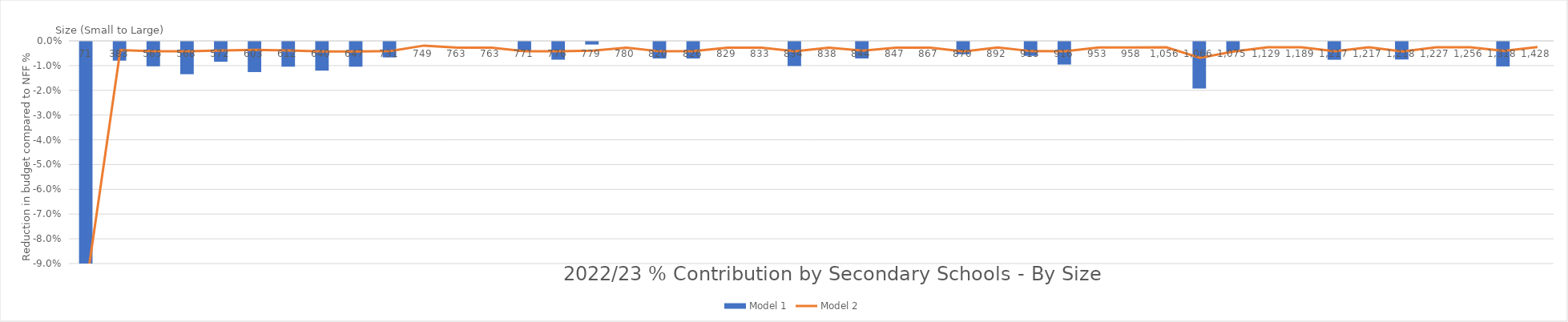
| Category | Model 1 |
|---|---|
| 70.9 | -0.106 |
| 383.0 | -0.008 |
| 565.0 | -0.01 |
| 568.0 | -0.013 |
| 572.0 | -0.008 |
| 603.0 | -0.012 |
| 612.0 | -0.01 |
| 640.0 | -0.012 |
| 647.0 | -0.01 |
| 730.8 | -0.006 |
| 748.5 | 0 |
| 763.0 | 0 |
| 763.0 | 0 |
| 771.0 | -0.004 |
| 776.0 | -0.007 |
| 779.0 | -0.001 |
| 780.0 | 0 |
| 820.0 | -0.007 |
| 825.8 | -0.007 |
| 829.0 | 0 |
| 833.0 | 0 |
| 834.0 | -0.01 |
| 838.0 | 0 |
| 844.0 | -0.007 |
| 847.0 | 0 |
| 866.8 | 0 |
| 870.0 | -0.005 |
| 892.0 | 0 |
| 913.0 | -0.006 |
| 916.0 | -0.009 |
| 953.0 | 0 |
| 958.0 | 0 |
| 1056.2 | 0 |
| 1065.8 | -0.019 |
| 1075.0 | -0.004 |
| 1129.0 | 0 |
| 1189.0 | 0 |
| 1217.0 | -0.007 |
| 1217.0 | 0 |
| 1218.0 | -0.007 |
| 1227.0 | 0 |
| 1256.0 | 0 |
| 1318.0 | -0.01 |
| 1428.0 | 0 |